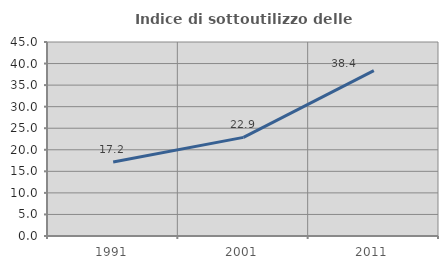
| Category | Indice di sottoutilizzo delle abitazioni  |
|---|---|
| 1991.0 | 17.176 |
| 2001.0 | 22.878 |
| 2011.0 | 38.356 |